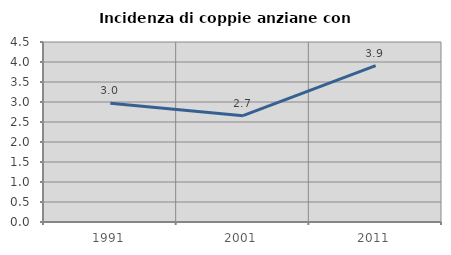
| Category | Incidenza di coppie anziane con figli |
|---|---|
| 1991.0 | 2.97 |
| 2001.0 | 2.659 |
| 2011.0 | 3.912 |